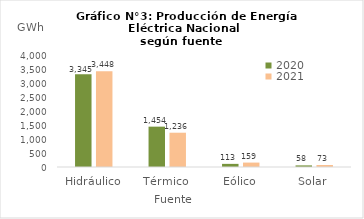
| Category | 2020 | 2021 |
|---|---|---|
| Hidráulico | 3344.829 | 3447.778 |
| Térmico | 1454.059 | 1235.605 |
| Eólico | 112.897 | 159.173 |
| Solar | 57.716 | 72.948 |